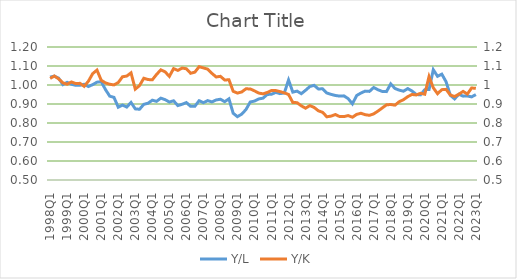
| Category | Y/L |
|---|---|
| 1998Q1 | 1.042 |
| 1998Q2 | 1.047 |
| 1998Q3 | 1.036 |
| 1998Q4 | 1.002 |
| 1999Q1 | 1.014 |
| 1999Q2 | 1.004 |
| 1999Q3 | 0.998 |
| 1999Q4 | 0.999 |
| 2000Q1 | 1.004 |
| 2000Q2 | 0.992 |
| 2000Q3 | 1.002 |
| 2000Q4 | 1.015 |
| 2001Q1 | 1.017 |
| 2001Q2 | 0.976 |
| 2001Q3 | 0.941 |
| 2001Q4 | 0.935 |
| 2002Q1 | 0.883 |
| 2002Q2 | 0.894 |
| 2002Q3 | 0.884 |
| 2002Q4 | 0.908 |
| 2003Q1 | 0.874 |
| 2003Q2 | 0.872 |
| 2003Q3 | 0.898 |
| 2003Q4 | 0.904 |
| 2004Q1 | 0.92 |
| 2004Q2 | 0.914 |
| 2004Q3 | 0.931 |
| 2004Q4 | 0.923 |
| 2005Q1 | 0.91 |
| 2005Q2 | 0.917 |
| 2005Q3 | 0.892 |
| 2005Q4 | 0.899 |
| 2006Q1 | 0.908 |
| 2006Q2 | 0.888 |
| 2006Q3 | 0.888 |
| 2006Q4 | 0.917 |
| 2007Q1 | 0.907 |
| 2007Q2 | 0.918 |
| 2007Q3 | 0.911 |
| 2007Q4 | 0.921 |
| 2008Q1 | 0.925 |
| 2008Q2 | 0.912 |
| 2008Q3 | 0.927 |
| 2008Q4 | 0.851 |
| 2009Q1 | 0.833 |
| 2009Q2 | 0.847 |
| 2009Q3 | 0.871 |
| 2009Q4 | 0.911 |
| 2010Q1 | 0.915 |
| 2010Q2 | 0.927 |
| 2010Q3 | 0.931 |
| 2010Q4 | 0.95 |
| 2011Q1 | 0.951 |
| 2011Q2 | 0.961 |
| 2011Q3 | 0.955 |
| 2011Q4 | 0.958 |
| 2012Q1 | 1.026 |
| 2012Q2 | 0.962 |
| 2012Q3 | 0.968 |
| 2012Q4 | 0.954 |
| 2013Q1 | 0.972 |
| 2013Q2 | 0.992 |
| 2013Q3 | 0.998 |
| 2013Q4 | 0.979 |
| 2014Q1 | 0.98 |
| 2014Q2 | 0.958 |
| 2014Q3 | 0.951 |
| 2014Q4 | 0.945 |
| 2015Q1 | 0.942 |
| 2015Q2 | 0.943 |
| 2015Q3 | 0.928 |
| 2015Q4 | 0.901 |
| 2016Q1 | 0.945 |
| 2016Q2 | 0.958 |
| 2016Q3 | 0.968 |
| 2016Q4 | 0.966 |
| 2017Q1 | 0.987 |
| 2017Q2 | 0.975 |
| 2017Q3 | 0.966 |
| 2017Q4 | 0.965 |
| 2018Q1 | 1.006 |
| 2018Q2 | 0.982 |
| 2018Q3 | 0.973 |
| 2018Q4 | 0.967 |
| 2019Q1 | 0.981 |
| 2019Q2 | 0.968 |
| 2019Q3 | 0.95 |
| 2019Q4 | 0.948 |
| 2020Q1 | 0.976 |
| 2020Q2 | 0.976 |
| 2020Q3 | 1.08 |
| 2020Q4 | 1.046 |
| 2021Q1 | 1.057 |
| 2021Q2 | 1.017 |
| 2021Q3 | 0.946 |
| 2021Q4 | 0.927 |
| 2022Q1 | 0.951 |
| 2022Q2 | 0.941 |
| 2022Q3 | 0.942 |
| 2022Q4 | 0.938 |
| 2023Q1 | 0.949 |